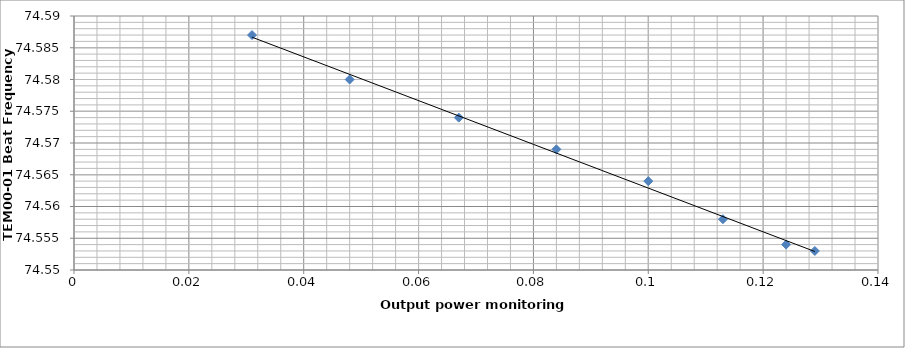
| Category | Series 0 |
|---|---|
| 0.129 | 74.553 |
| 0.124 | 74.554 |
| 0.113 | 74.558 |
| 0.1 | 74.564 |
| 0.084 | 74.569 |
| 0.067 | 74.574 |
| 0.048 | 74.58 |
| 0.031 | 74.587 |